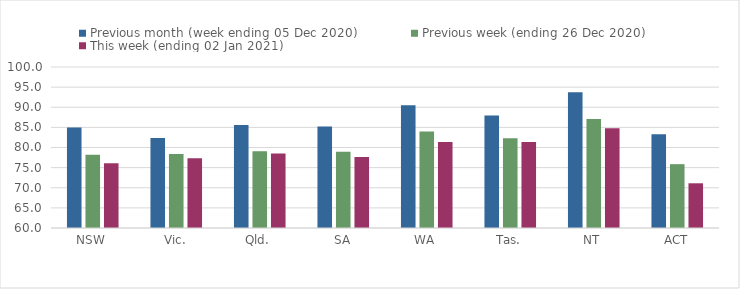
| Category | Previous month (week ending 05 Dec 2020) | Previous week (ending 26 Dec 2020) | This week (ending 02 Jan 2021) |
|---|---|---|---|
| NSW | 84.97 | 78.17 | 76.11 |
| Vic. | 82.37 | 78.36 | 77.32 |
| Qld. | 85.62 | 79.09 | 78.49 |
| SA | 85.23 | 78.93 | 77.67 |
| WA | 90.52 | 83.98 | 81.36 |
| Tas. | 87.92 | 82.32 | 81.39 |
| NT | 93.71 | 87.05 | 84.78 |
| ACT | 83.29 | 75.86 | 71.11 |